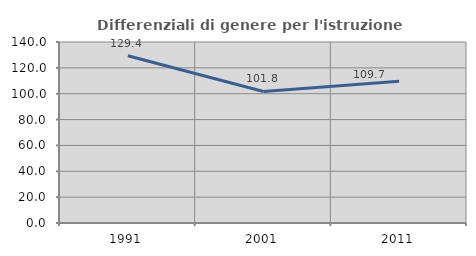
| Category | Differenziali di genere per l'istruzione superiore |
|---|---|
| 1991.0 | 129.367 |
| 2001.0 | 101.759 |
| 2011.0 | 109.708 |